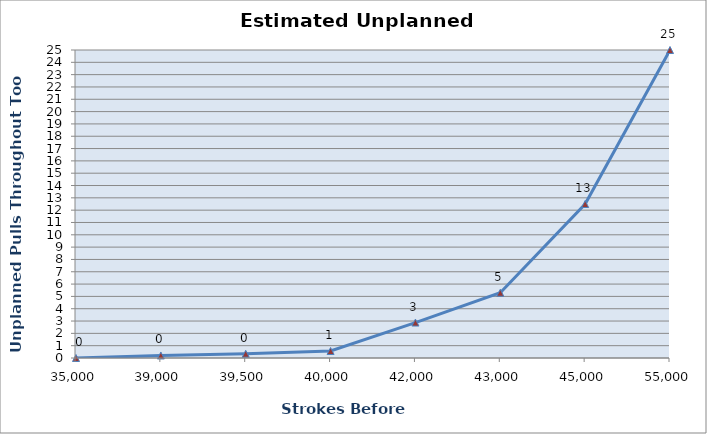
| Category | Series 0 |
|---|---|
| 35000.0 | 0 |
| 39000.0 | 0.205 |
| 39500.0 | 0.348 |
| 40000.0 | 0.569 |
| 42000.0 | 2.878 |
| 43000.0 | 5.298 |
| 45000.0 | 12.5 |
| 55000.0 | 24.998 |